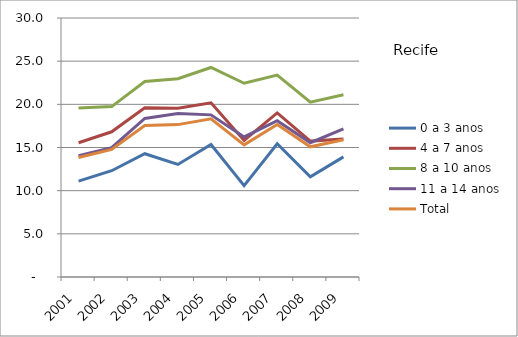
| Category | 0 a 3 anos | 4 a 7 anos | 8 a 10 anos | 11 a 14 anos | Total |
|---|---|---|---|---|---|
| 2001.0 | 11.1 | 15.55 | 19.57 | 14.05 | 13.85 |
| 2002.0 | 12.31 | 16.82 | 19.74 | 14.99 | 14.78 |
| 2003.0 | 14.28 | 19.61 | 22.65 | 18.37 | 17.54 |
| 2004.0 | 13.04 | 19.56 | 22.97 | 18.94 | 17.65 |
| 2005.0 | 15.35 | 20.18 | 24.27 | 18.78 | 18.33 |
| 2006.0 | 10.58 | 15.81 | 22.44 | 16.22 | 15.31 |
| 2007.0 | 15.43 | 19 | 23.39 | 18.11 | 17.67 |
| 2008.0 | 11.61 | 15.74 | 20.25 | 15.55 | 15.08 |
| 2009.0 | 13.91 | 15.98 | 21.1 | 17.15 | 15.89 |